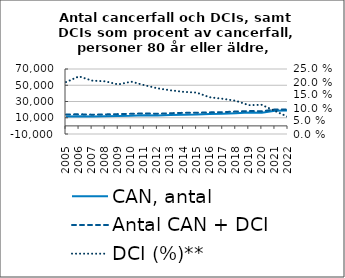
| Category | CAN, antal | Antal CAN + DCI |
|---|---|---|
| 2005.0 | 11627 | 13948 |
| 2006.0 | 11716 | 14312 |
| 2007.0 | 11443 | 13793 |
| 2008.0 | 11721 | 14095 |
| 2009.0 | 12166 | 14485 |
| 2010.0 | 12318 | 14797 |
| 2011.0 | 12944 | 15375 |
| 2012.0 | 12683 | 14912 |
| 2013.0 | 13343 | 15585 |
| 2014.0 | 13831 | 16073 |
| 2015.0 | 13938 | 16157 |
| 2016.0 | 14540 | 16594 |
| 2017.0 | 14879 | 16894 |
| 2018.0 | 15634 | 17631 |
| 2019.0 | 16472 | 18300 |
| 2020.0 | 16160 | 17973 |
| 2021.0 | 18558 | 20203 |
| 2022.0 | 18989 | 20237 |